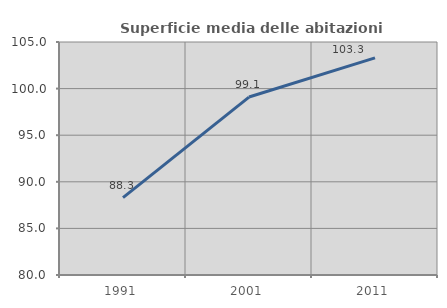
| Category | Superficie media delle abitazioni occupate |
|---|---|
| 1991.0 | 88.31 |
| 2001.0 | 99.093 |
| 2011.0 | 103.292 |